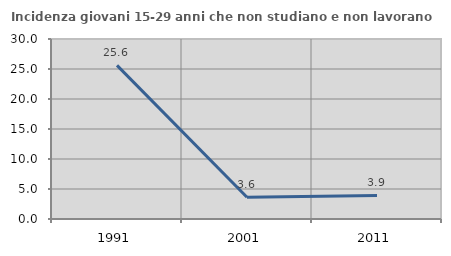
| Category | Incidenza giovani 15-29 anni che non studiano e non lavorano  |
|---|---|
| 1991.0 | 25.597 |
| 2001.0 | 3.636 |
| 2011.0 | 3.922 |